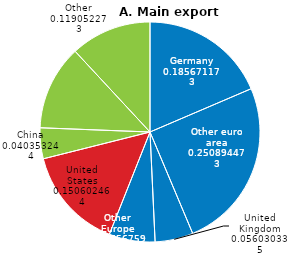
| Category | Series 1 |
|---|---|
| Germany | 18.567 |
| Other euro area | 25.089 |
| United Kingdom | 5.603 |
| Other Europe | 6.757 |
| United States | 15.06 |
| China | 4.535 |
| Other Asia | 12.483 |
| Other | 11.905 |